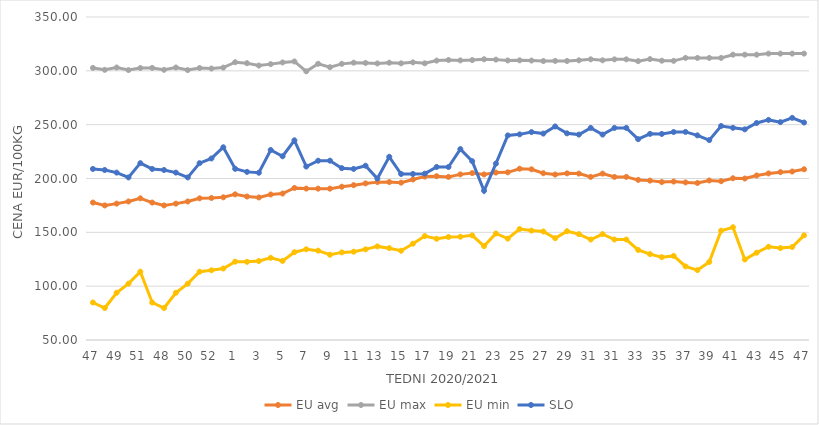
| Category | EU avg | EU max | EU min | SLO |
|---|---|---|---|---|
| 47.0 | 177.656 | 302.7 | 84.832 | 208.87 |
| 48.0 | 174.977 | 300.94 | 79.697 | 207.9 |
| 49.0 | 176.65 | 303.09 | 93.873 | 205.48 |
| 50.0 | 178.648 | 300.7 | 102.316 | 200.99 |
| 51.0 | 181.58 | 302.62 | 113.46 | 214.25 |
| 47.0 | 177.656 | 302.7 | 84.832 | 208.87 |
| 48.0 | 174.977 | 300.94 | 79.697 | 207.9 |
| 49.0 | 176.65 | 303.09 | 93.873 | 205.48 |
| 50.0 | 178.648 | 300.7 | 102.316 | 200.99 |
| 51.0 | 181.58 | 302.62 | 113.46 | 214.25 |
| 52.0 | 181.9 | 302.14 | 114.76 | 218.61 |
| 53.0 | 182.536 | 303 | 116.375 | 229 |
| 1.0 | 185.3 | 308 | 122.769 | 209 |
| 2.0 | 183.25 | 307.1 | 122.609 | 206.15 |
| 3.0 | 182.393 | 304.91 | 123.32 | 205.35 |
| 4.0 | 185.158 | 306.22 | 126.329 | 226.48 |
| 5.0 | 186.04 | 307.79 | 123.461 | 220.65 |
| 6.0 | 191.206 | 308.7 | 131.528 | 235.46 |
| 7.0 | 190.629 | 299.55 | 134.262 | 211.1 |
| 8.0 | 190.57 | 306.55 | 132.97 | 216.51 |
| 9.0 | 190.562 | 303.4 | 129.173 | 216.54 |
| 10.0 | 192.373 | 306.48 | 131.374 | 209.61 |
| 11.0 | 193.79 | 307.58 | 132.024 | 208.91 |
| 12.0 | 195.449 | 307.33 | 134.212 | 211.87 |
| 13.0 | 196.631 | 306.85 | 136.936 | 199.93 |
| 14.0 | 196.702 | 307.56 | 135.297 | 220.15 |
| 15.0 | 196.13 | 306.96 | 132.893 | 204.2 |
| 16.0 | 199.1 | 307.87 | 139.462 | 204.2 |
| 17.0 | 201.754 | 306.98 | 146.538 | 204.51 |
| 18.0 | 202.13 | 309.49 | 144.017 | 210.72 |
| 19.0 | 201.439 | 310.06 | 145.644 | 210.68 |
| 20.0 | 203.834 | 309.69 | 145.911 | 227.32 |
| 21.0 | 205.04 | 309.99 | 147.188 | 216.08 |
| 22.0 | 203.79 | 310.76 | 137.177 | 188.6 |
| 23.0 | 205.51 | 310.41 | 148.928 | 213.84 |
| 24.0 | 205.73 | 309.64 | 144.161 | 239.99 |
| 25.0 | 209.095 | 309.74 | 153.081 | 240.99 |
| 26.0 | 208.551 | 309.55 | 151.599 | 243.11 |
| 27.0 | 204.914 | 309.08 | 150.789 | 241.72 |
| 28.0 | 203.681 | 309.21 | 144.56 | 248.33 |
| 29.0 | 204.773 | 309.15 | 151.052 | 241.96 |
| 30.0 | 204.558 | 309.78 | 148.33 | 240.79 |
| 31.0 | 201.483 | 310.67 | 143.33 | 247 |
| 30.0 | 204.558 | 309.78 | 148.33 | 240.79 |
| 31.0 | 201.483 | 310.67 | 143.33 | 247 |
| 32.0 | 201.483 | 310.67 | 143.33 | 247 |
| 33.0 | 198.691 | 309 | 133.607 | 236.54 |
| 34.0 | 198.027 | 310.9 | 129.797 | 241.45 |
| 35.0 | 196.72 | 309.41 | 126.926 | 241.39 |
| 36.0 | 197.157 | 309.28 | 128.099 | 243.19 |
| 37.0 | 196.375 | 312 | 118.364 | 243.28 |
| 38.0 | 195.821 | 312 | 114.892 | 240.06 |
| 39.0 | 198.179 | 312 | 122.517 | 235.66 |
| 40.0 | 197.482 | 312 | 151.488 | 248.77 |
| 41.0 | 200.22 | 315 | 154.74 | 247.07 |
| 42.0 | 199.965 | 315 | 124.748 | 245.64 |
| 43.0 | 202.804 | 315 | 131.104 | 251.53 |
| 44.0 | 204.713 | 316 | 136.6 | 254.42 |
| 45.0 | 205.906 | 316 | 135.362 | 252.35 |
| 46.0 | 206.476 | 316 | 136.39 | 256.33 |
| 47.0 | 208.57 | 316 | 147.192 | 252.01 |